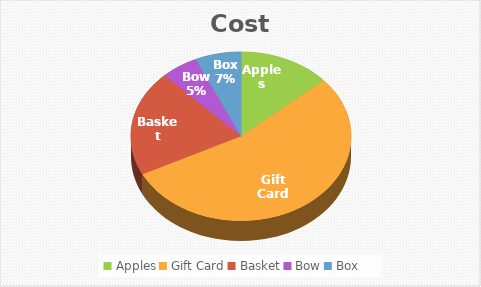
| Category | Cost |
|---|---|
| Apples | 2.5 |
| Gift Card | 10 |
| Basket | 3.75 |
| Bow | 1 |
| Box | 1.25 |